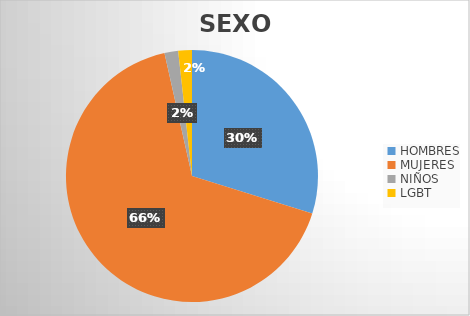
| Category | Series 0 |
|---|---|
| HOMBRES | 17 |
| MUJERES | 38 |
| NIÑOS | 1 |
| LGBT | 1 |